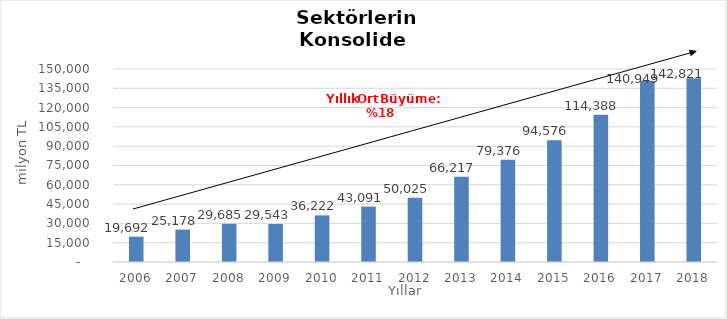
| Category | Toplam |
|---|---|
| 2006.0 | 19691.807 |
| 2007.0 | 25178.471 |
| 2008.0 | 29685 |
| 2009.0 | 29543.192 |
| 2010.0 | 36222.019 |
| 2011.0 | 43090.622 |
| 2012.0 | 50025.409 |
| 2013.0 | 66217.364 |
| 2014.0 | 79376 |
| 2015.0 | 94576 |
| 2016.0 | 114388 |
| 2017.0 | 140949 |
| 2018.0 | 142821 |